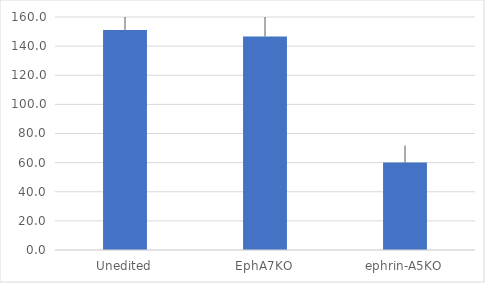
| Category | Series 0 |
|---|---|
| Unedited | 151.089 |
| EphA7KO | 146.604 |
| ephrin-A5KO | 60.083 |